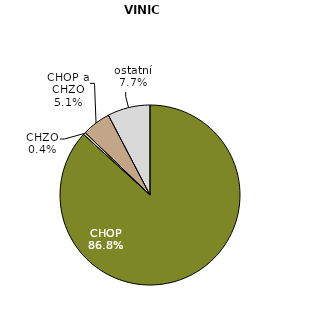
| Category | VINICE |
|---|---|
| CHOP | 86.767 |
| CHZO | 0.426 |
| CHOP a CHZO | 5.15 |
| ostatní | 7.657 |